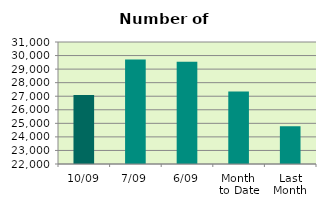
| Category | Series 0 |
|---|---|
| 10/09 | 27088 |
| 7/09 | 29714 |
| 6/09 | 29550 |
| Month 
to Date | 27356.333 |
| Last
Month | 24784.957 |